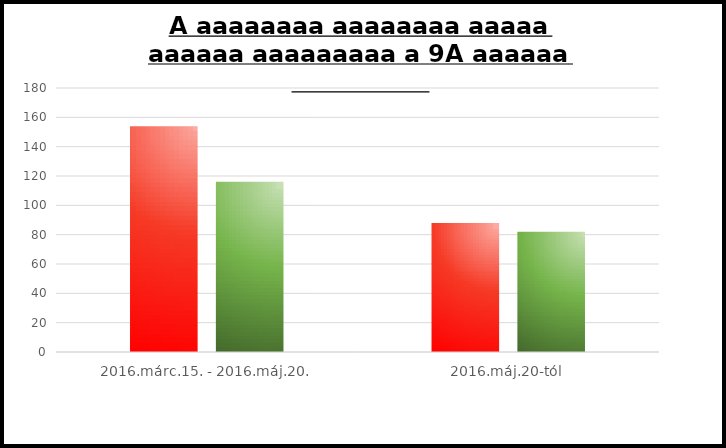
| Category | Visszautasítva | Valószínűsíthető találat |
|---|---|---|
| 2016.márc.15. - 2016.máj.20. | 154 | 116 |
| 2016.máj.20-tól | 88 | 82 |